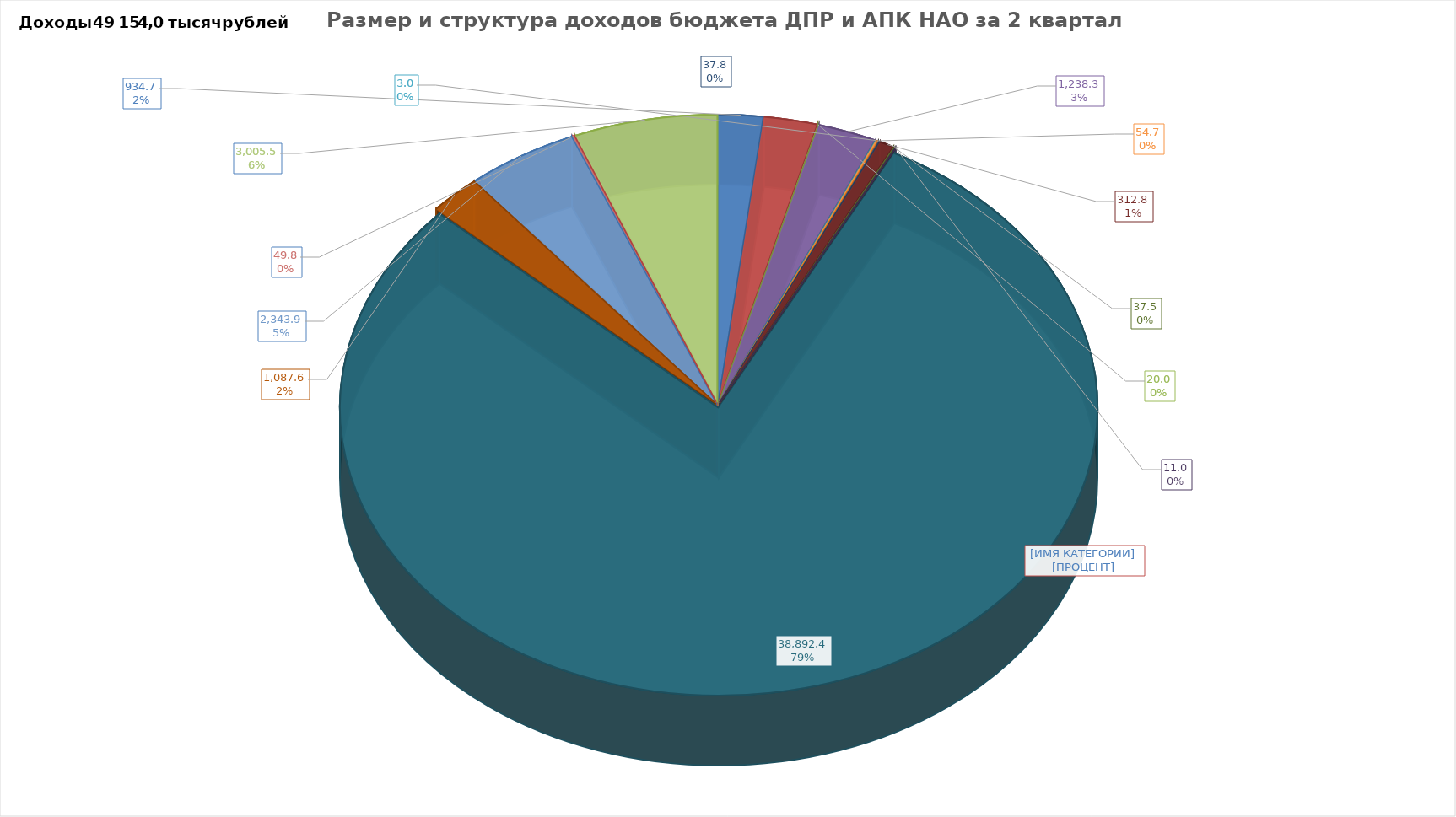
| Category | Размер и структура доходов бюджета ДПР и АПК НАО за 2 квартал 2019 г. |
|---|---|
| 0 | 934.7 |
| 1 | 1125 |
| 2 | 20 |
| 3 | 1238.3 |
| 4 | 3 |
| 5 | 54.7 |
| 6 | 37.8 |
| 7 | 312.8 |
| 8 | 37.5 |
| 9 | 11 |
| 10 | 38892.4 |
| 11 | 1087.6 |
| 12 | 2343.9 |
| 13 | 49.8 |
| 14 | 3005.5 |